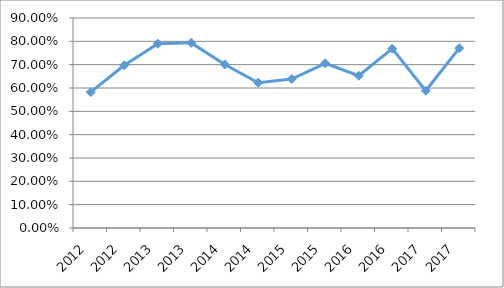
| Category | FIS2-N2O21 |
|---|---|
| 2012.0 | 0.582 |
| 2012.0 | 0.698 |
| 2013.0 | 0.79 |
| 2013.0 | 0.793 |
| 2014.0 | 0.701 |
| 2014.0 | 0.623 |
| 2015.0 | 0.638 |
| 2015.0 | 0.706 |
| 2016.0 | 0.653 |
| 2016.0 | 0.769 |
| 2017.0 | 0.588 |
| 2017.0 | 0.771 |